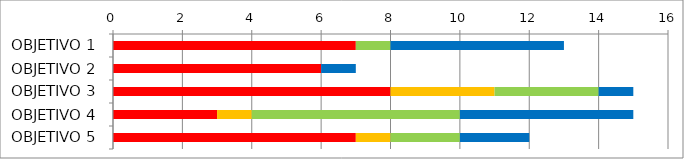
| Category | Series 1 | Series 2 | Series 3 | Series 4 | Series 5 |
|---|---|---|---|---|---|
| OBJETIVO 1 | 0 | 7 | 0 | 1 | 5 |
| OBJETIVO 2 | 0 | 6 | 0 | 0 | 1 |
| OBJETIVO 3 | 0 | 8 | 3 | 3 | 1 |
| OBJETIVO 4 | 0 | 3 | 1 | 6 | 5 |
| OBJETIVO 5 | 0 | 7 | 1 | 2 | 2 |